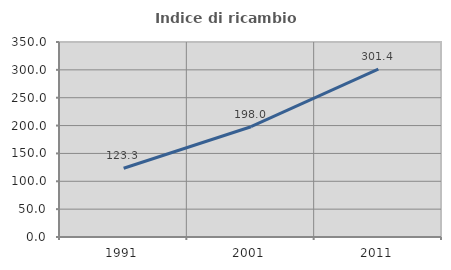
| Category | Indice di ricambio occupazionale  |
|---|---|
| 1991.0 | 123.333 |
| 2001.0 | 197.959 |
| 2011.0 | 301.408 |